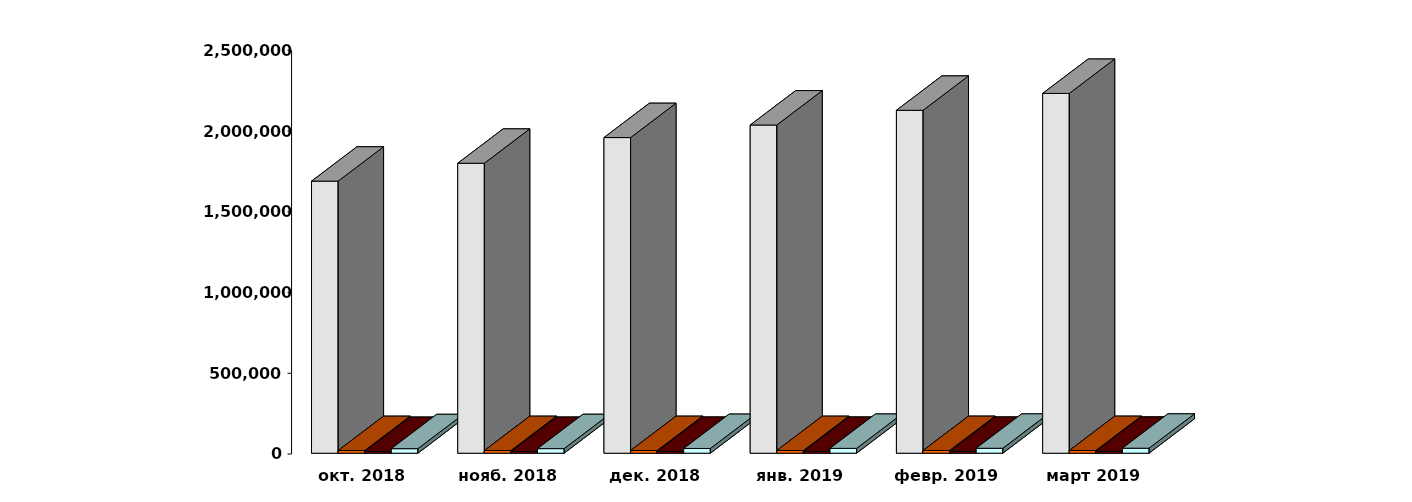
| Category | Физические лица | Юридические лица | Иностранные лица | Клиенты, передавшие свои средства в ДУ |
|---|---|---|---|---|
| 2018-10-28 | 1685168 | 16513 | 10989 | 28000 |
| 2018-11-28 | 1796071 | 16547 | 11151 | 28275 |
| 2018-12-28 | 1955118 | 16631 | 11453 | 29262 |
| 2019-01-28 | 2032931 | 16590 | 11564 | 29851 |
| 2019-02-28 | 2124042 | 16658 | 11740 | 30559 |
| 2019-03-28 | 2228680 | 16743 | 11947 | 30898 |